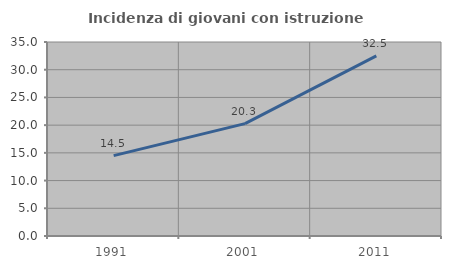
| Category | Incidenza di giovani con istruzione universitaria |
|---|---|
| 1991.0 | 14.496 |
| 2001.0 | 20.28 |
| 2011.0 | 32.503 |